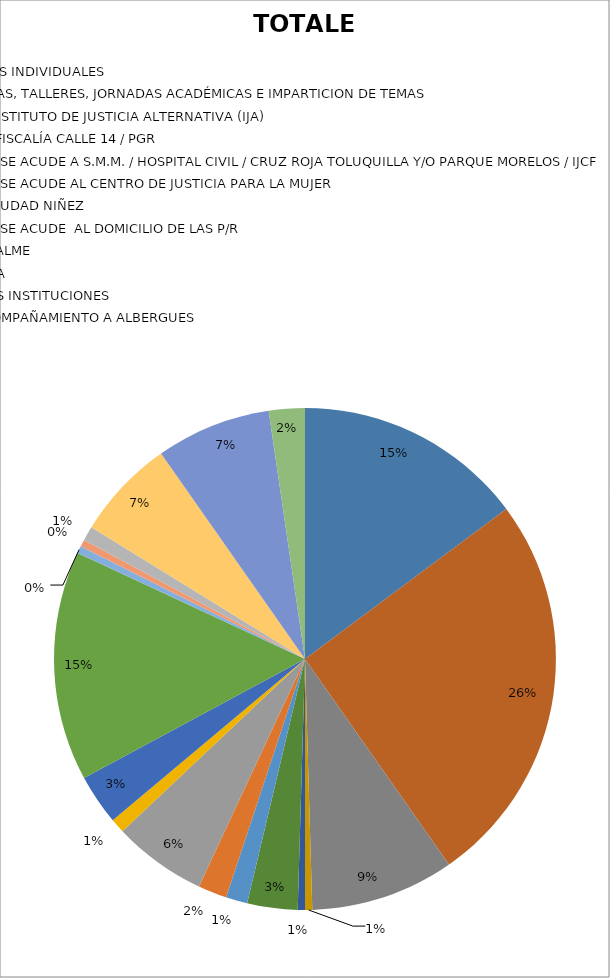
| Category | TOTALES |
|---|---|
| ASESORIAS JURÍDICAS | 32 |
| TERAPIAS PSICOLÓGICAS INDIVIDUALES | 55 |
| ACUDIR A CONFERENCIAS, TALLERES, JORNADAS ACADÉMICAS E IMPARTICION DE TEMAS | 20 |
| ACOMPAÑAMIENTO A INSTITUTO DE JUSTICIA ALTERNATIVA (IJA) | 1 |
| ACOMPAÑAMIENTOS A FISCALÍA CALLE 14 / PGR | 1 |
| ACOMPAÑAMIENTO Y/O SE ACUDE A S.M.M. / HOSPITAL CIVIL / CRUZ ROJA TOLUQUILLA Y/O PARQUE MORELOS / IJCF / CENTRAL CAMIONERA     | 7 |
| ACOMPAÑAMIENTO Y/O SE ACUDE AL CENTRO DE JUSTICIA PARA LA MUJER | 3 |
| ACOMPAÑAMIENTO A CIUDAD NIÑEZ  | 4 |
| ACOMPAÑAMIENTO Y/O SE ACUDE  AL DOMICILIO DE LAS P/R | 13 |
| ACOMPAÑAMIENTO A SALME | 2 |
| CANALIZACIÓN INTERNA | 7 |
| CANALIZACIÓN A OTRAS INSTITUCIONES | 32 |
| CANALIZACIÓN Y/O ACOMPAÑAMIENTO A ALBERGUES  | 1 |
| VISITAS DOMICILIARIAS | 1 |
| PUESTA A DISPOSICIÓN DE  LA FISCALÍA A NIÑAS, NIÑOS Y ADOLESCENTES EN DEPOSITO Y/O RESGUARDO DE CANNAT | 2 |
| ENTREGAS CANNAT                       (ACTAS CIRCUNSTANCIADAS) | 14 |
| ATENCIONES CANNAT | 16 |
| ATENCIONES Y AUXILIO PSICOLÓGICO | 5 |